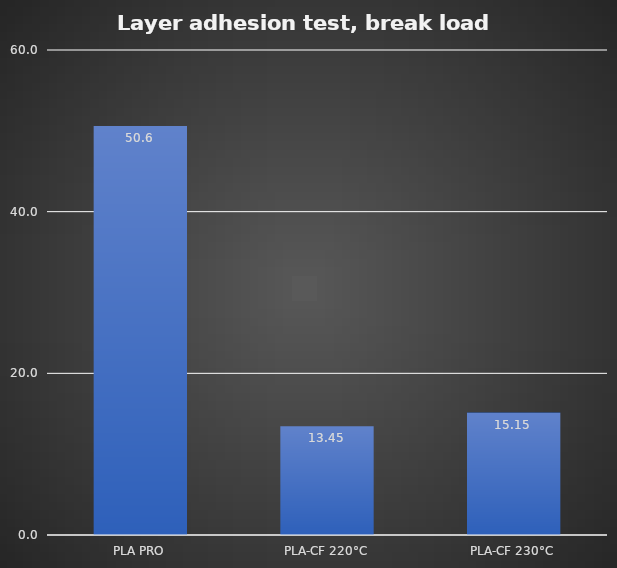
| Category | Average |
|---|---|
| PLA PRO | 50.6 |
| PLA-CF 220°C | 13.45 |
| PLA-CF 230°C | 15.15 |